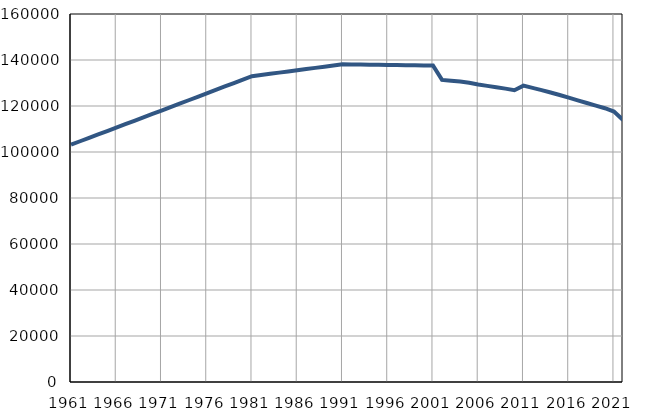
| Category | Број
становника |
|---|---|
| 1961.0 | 103190 |
| 1962.0 | 104673 |
| 1963.0 | 106155 |
| 1964.0 | 107638 |
| 1965.0 | 109120 |
| 1966.0 | 110603 |
| 1967.0 | 112086 |
| 1968.0 | 113568 |
| 1969.0 | 115051 |
| 1970.0 | 116533 |
| 1971.0 | 118016 |
| 1972.0 | 119511 |
| 1973.0 | 121007 |
| 1974.0 | 122502 |
| 1975.0 | 123998 |
| 1976.0 | 125493 |
| 1977.0 | 126990 |
| 1978.0 | 128486 |
| 1979.0 | 129981 |
| 1980.0 | 131476 |
| 1981.0 | 132972 |
| 1982.0 | 133487 |
| 1983.0 | 134000 |
| 1984.0 | 134514 |
| 1985.0 | 135028 |
| 1986.0 | 135542 |
| 1987.0 | 136056 |
| 1988.0 | 136570 |
| 1989.0 | 137083 |
| 1990.0 | 137597 |
| 1991.0 | 138111 |
| 1992.0 | 138058 |
| 1993.0 | 138006 |
| 1994.0 | 137953 |
| 1995.0 | 137901 |
| 1996.0 | 137848 |
| 1997.0 | 137796 |
| 1998.0 | 137744 |
| 1999.0 | 137691 |
| 2000.0 | 137639 |
| 2001.0 | 137586 |
| 2002.0 | 131345 |
| 2003.0 | 130987 |
| 2004.0 | 130626 |
| 2005.0 | 130083 |
| 2006.0 | 129370 |
| 2007.0 | 128758 |
| 2008.0 | 128196 |
| 2009.0 | 127551 |
| 2010.0 | 126860 |
| 2011.0 | 128862 |
| 2012.0 | 127892 |
| 2013.0 | 126900 |
| 2014.0 | 125853 |
| 2015.0 | 124795 |
| 2016.0 | 123631 |
| 2017.0 | 122437 |
| 2018.0 | 121293 |
| 2019.0 | 120154 |
| 2020.0 | 119035 |
| 2021.0 | 117567 |
| 2022.0 | 113951 |